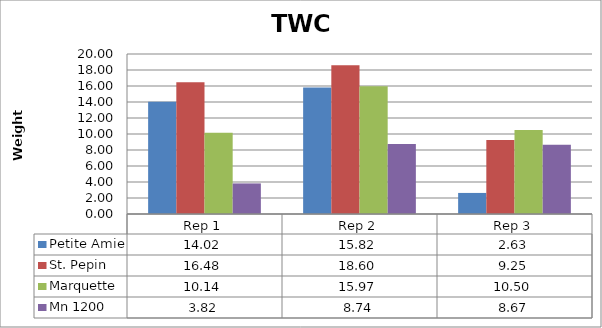
| Category | Petite Amie | St. Pepin | Marquette | Mn 1200 |
|---|---|---|---|---|
| 0 | 14.022 | 16.478 | 10.144 | 3.822 |
| 1 | 15.822 | 18.6 | 15.967 | 8.744 |
| 2 | 2.633 | 9.246 | 10.5 | 8.667 |